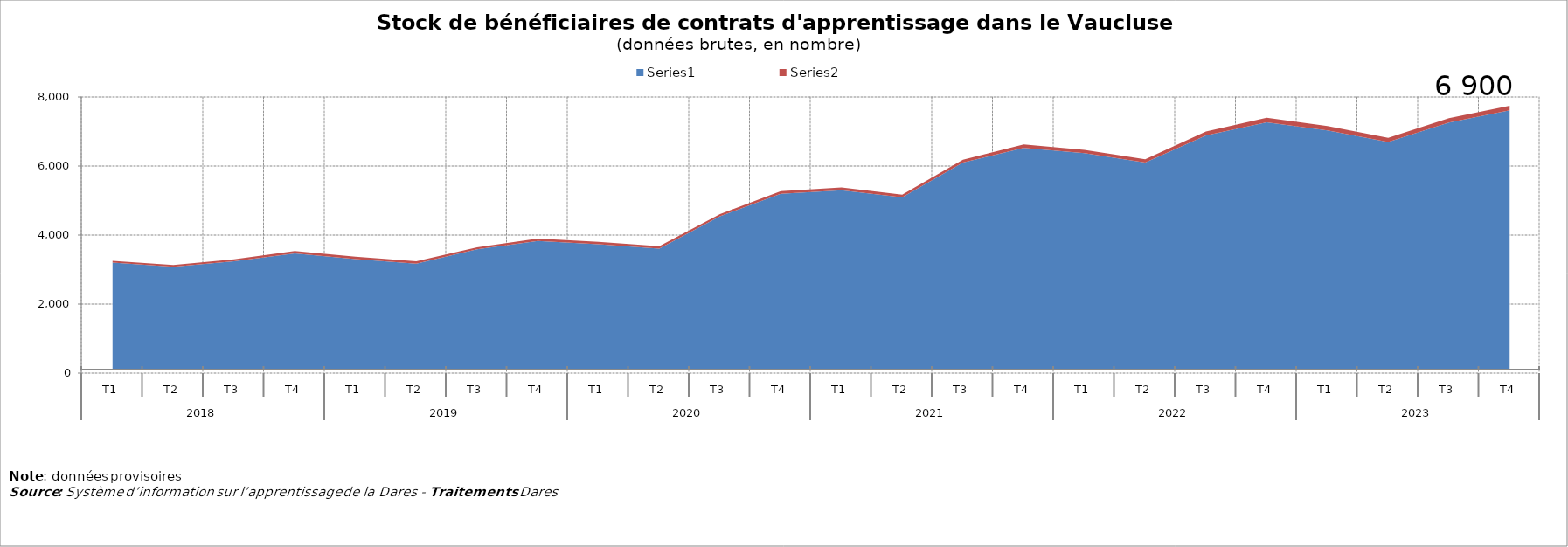
| Category | Series 0 | Series 1 |
|---|---|---|
| 0 | 3202 | 52 |
| 1 | 3080 | 51 |
| 2 | 3240 | 59 |
| 3 | 3467 | 71 |
| 4 | 3303 | 71 |
| 5 | 3173 | 70 |
| 6 | 3590 | 58 |
| 7 | 3830 | 67 |
| 8 | 3736 | 69 |
| 9 | 3606 | 69 |
| 10 | 4544 | 66 |
| 11 | 5196 | 79 |
| 12 | 5297 | 81 |
| 13 | 5094 | 79 |
| 14 | 6099 | 86 |
| 15 | 6528 | 98 |
| 16 | 6372 | 98 |
| 17 | 6100 | 98 |
| 18 | 6885 | 112 |
| 19 | 7265 | 132 |
| 20 | 7032 | 126 |
| 21 | 6696 | 123 |
| 22 | 7261 | 124 |
| 23 | 7617 | 133 |